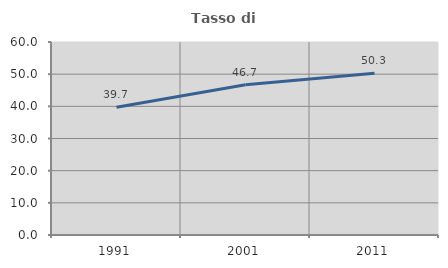
| Category | Tasso di occupazione   |
|---|---|
| 1991.0 | 39.689 |
| 2001.0 | 46.707 |
| 2011.0 | 50.298 |